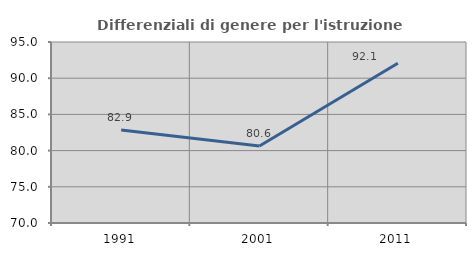
| Category | Differenziali di genere per l'istruzione superiore |
|---|---|
| 1991.0 | 82.852 |
| 2001.0 | 80.632 |
| 2011.0 | 92.072 |